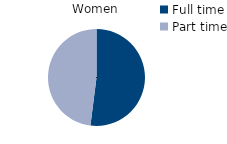
| Category | Women |
|---|---|
| Full time | 52 |
| Part time | 48 |